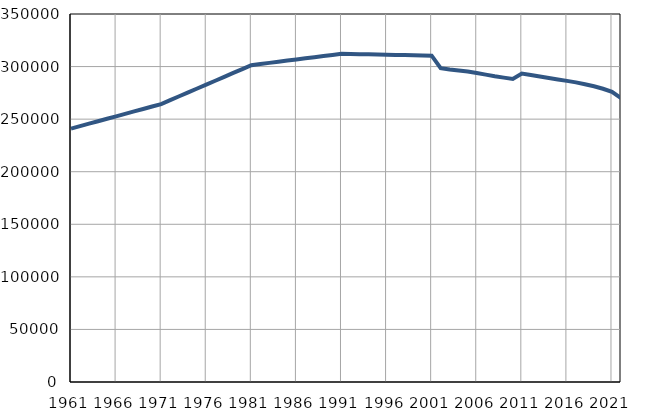
| Category | Population
size |
|---|---|
| 1961.0 | 241047 |
| 1962.0 | 243377 |
| 1963.0 | 245706 |
| 1964.0 | 248036 |
| 1965.0 | 250366 |
| 1966.0 | 252696 |
| 1967.0 | 255025 |
| 1968.0 | 257355 |
| 1969.0 | 259685 |
| 1970.0 | 262014 |
| 1971.0 | 264344 |
| 1972.0 | 268045 |
| 1973.0 | 271746 |
| 1974.0 | 275447 |
| 1975.0 | 279147 |
| 1976.0 | 282849 |
| 1977.0 | 286550 |
| 1978.0 | 290251 |
| 1979.0 | 293952 |
| 1980.0 | 297653 |
| 1981.0 | 301354 |
| 1982.0 | 302435 |
| 1983.0 | 303515 |
| 1984.0 | 304596 |
| 1985.0 | 305676 |
| 1986.0 | 306757 |
| 1987.0 | 307838 |
| 1988.0 | 308918 |
| 1989.0 | 309999 |
| 1990.0 | 311079 |
| 1991.0 | 312160 |
| 1992.0 | 311984 |
| 1993.0 | 311807 |
| 1994.0 | 311631 |
| 1995.0 | 311455 |
| 1996.0 | 311279 |
| 1997.0 | 311102 |
| 1998.0 | 310926 |
| 1999.0 | 310750 |
| 2000.0 | 310574 |
| 2001.0 | 310397 |
| 2002.0 | 298527 |
| 2003.0 | 297132 |
| 2004.0 | 296223 |
| 2005.0 | 295241 |
| 2006.0 | 293869 |
| 2007.0 | 292340 |
| 2008.0 | 290806 |
| 2009.0 | 289496 |
| 2010.0 | 288151 |
| 2011.0 | 293422 |
| 2012.0 | 292035 |
| 2013.0 | 290541 |
| 2014.0 | 289175 |
| 2015.0 | 287784 |
| 2016.0 | 286406 |
| 2017.0 | 284957 |
| 2018.0 | 283235 |
| 2019.0 | 281277 |
| 2020.0 | 278917 |
| 2021.0 | 275944 |
| 2022.0 | 270085 |